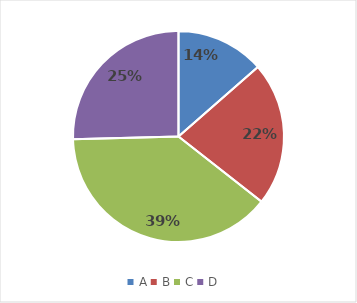
| Category | Series 0 |
|---|---|
| A | 0.136 |
| B | 0.22 |
| C | 0.39 |
| D | 0.254 |